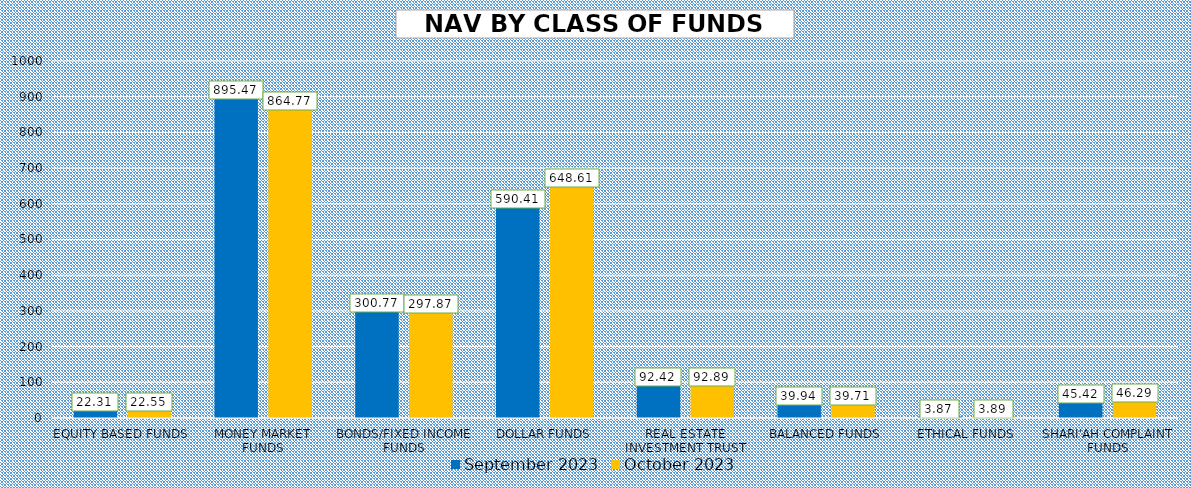
| Category | September 2023 | October 2023 |
|---|---|---|
| EQUITY BASED FUNDS | 22.305 | 22.548 |
| MONEY MARKET FUNDS | 895.47 | 864.77 |
| BONDS/FIXED INCOME FUNDS | 300.772 | 297.869 |
| DOLLAR FUNDS | 590.415 | 648.613 |
| REAL ESTATE INVESTMENT TRUST | 92.422 | 92.891 |
| BALANCED FUNDS | 39.942 | 39.715 |
| ETHICAL FUNDS | 3.869 | 3.894 |
| SHARI'AH COMPLAINT FUNDS | 45.423 | 46.293 |